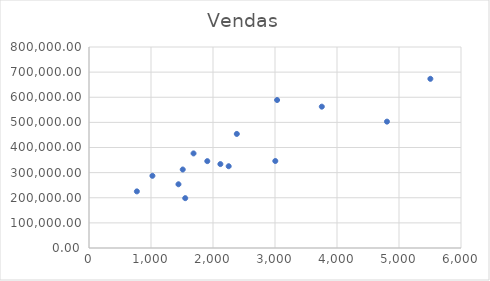
| Category | Vendas |
|---|---|
| 1512.0 | 312389 |
| 3005.0 | 346235 |
| 1686.0 | 376465 |
| 1908.0 | 345723 |
| 2384.0 | 453983 |
| 4806.0 | 502984 |
| 2253.0 | 325436 |
| 1443.0 | 253647 |
| 3755.0 | 562534 |
| 1023.0 | 287364 |
| 1552.0 | 198374 |
| 2119.0 | 333984 |
| 5506.0 | 673345 |
| 3034.0 | 588947 |
| 772.0 | 225364 |